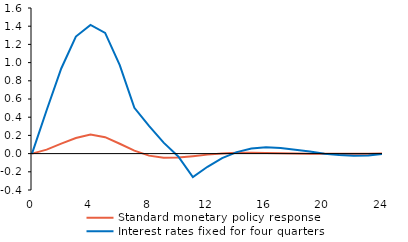
| Category | Standard monetary policy response | Interest rates fixed for four quarters |
|---|---|---|
| 0.0 | 0 | 0 |
| 1.0 | 0.043 | 0.476 |
| 2.0 | 0.109 | 0.936 |
| 3.0 | 0.171 | 1.286 |
| 4.0 | 0.21 | 1.414 |
| 5.0 | 0.18 | 1.326 |
| 6.0 | 0.108 | 0.972 |
| 7.0 | 0.032 | 0.503 |
| 8.0 | -0.022 | 0.304 |
| 9.0 | -0.046 | 0.12 |
| 10.0 | -0.044 | -0.032 |
| 11.0 | -0.029 | -0.258 |
| 12.0 | -0.011 | -0.145 |
| 13.0 | 0.002 | -0.049 |
| 14.0 | 0.008 | 0.016 |
| 15.0 | 0.009 | 0.056 |
| 16.0 | 0.006 | 0.071 |
| 17.0 | 0.003 | 0.061 |
| 18.0 | 0.001 | 0.042 |
| 19.0 | -0.001 | 0.023 |
| 20.0 | -0.001 | -0.001 |
| 21.0 | -0.001 | -0.016 |
| 22.0 | -0.001 | -0.025 |
| 23.0 | 0 | -0.02 |
| 24.0 | 0 | -0.002 |